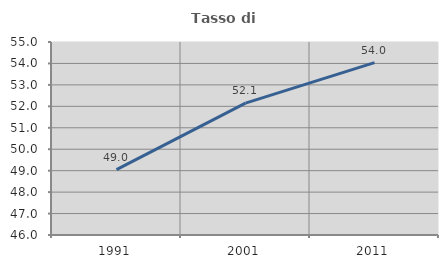
| Category | Tasso di occupazione   |
|---|---|
| 1991.0 | 49.047 |
| 2001.0 | 52.146 |
| 2011.0 | 54.037 |